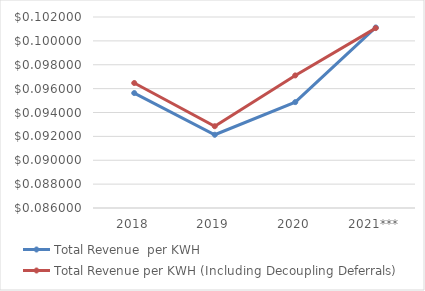
| Category | Total Revenue  per KWH | Total Revenue per KWH (Including Decoupling Deferrals) |
|---|---|---|
| 2018 | 0.096 | 0.096 |
| 2019 | 0.092 | 0.093 |
| 2020 | 0.095 | 0.097 |
| 2021*** | 0.101 | 0.101 |